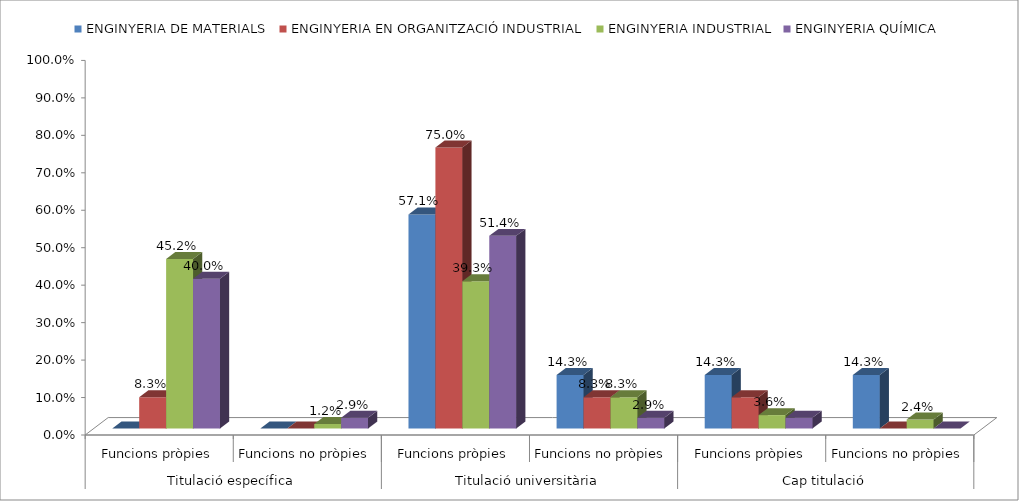
| Category | ENGINYERIA DE MATERIALS | ENGINYERIA EN ORGANITZACIÓ INDUSTRIAL | ENGINYERIA INDUSTRIAL | ENGINYERIA QUÍMICA |
|---|---|---|---|---|
| 0 | 0 | 0.083 | 0.452 | 0.4 |
| 1 | 0 | 0 | 0.012 | 0.029 |
| 2 | 0.571 | 0.75 | 0.393 | 0.514 |
| 3 | 0.143 | 0.083 | 0.083 | 0.029 |
| 4 | 0.143 | 0.083 | 0.036 | 0.029 |
| 5 | 0.143 | 0 | 0.024 | 0 |